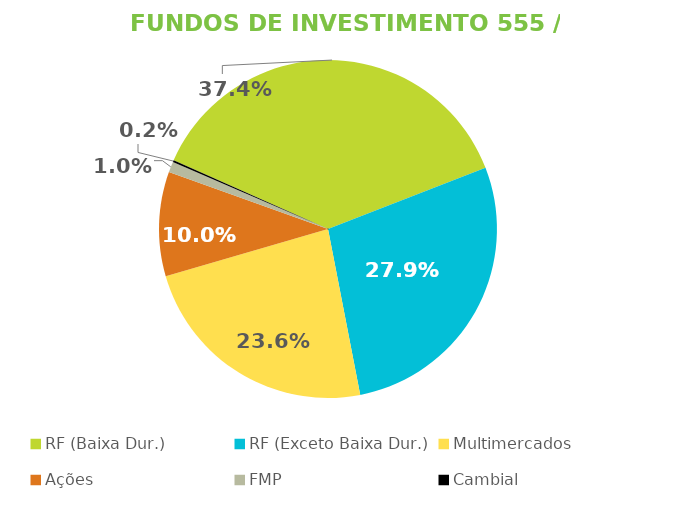
| Category | Fundos de Investimento 555 / FMP |
|---|---|
| RF (Baixa Dur.) | 0.374 |
| RF (Exceto Baixa Dur.) | 0.279 |
| Multimercados | 0.236 |
| Ações | 0.1 |
| FMP | 0.01 |
| Cambial | 0.002 |